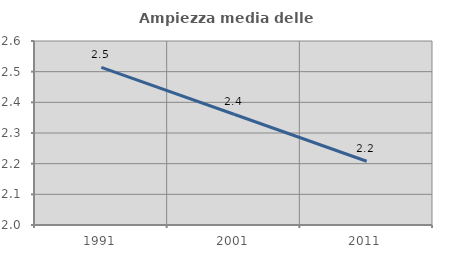
| Category | Ampiezza media delle famiglie |
|---|---|
| 1991.0 | 2.514 |
| 2001.0 | 2.361 |
| 2011.0 | 2.208 |